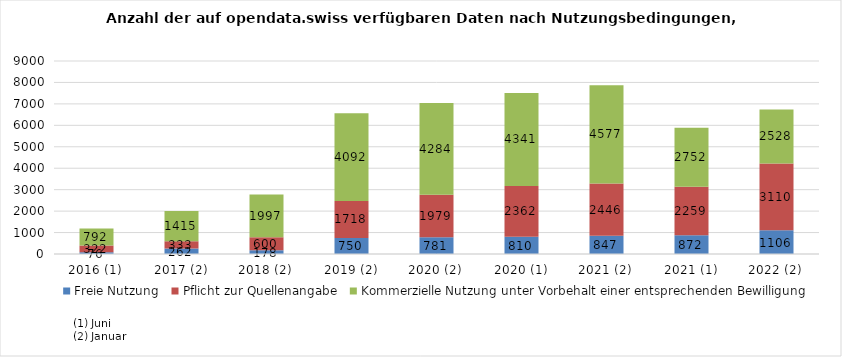
| Category | Freie Nutzung | Pflicht zur Quellenangabe | Kommerzielle Nutzung unter Vorbehalt einer entsprechenden Bewilligung |
|---|---|---|---|
| 2016 (1) | 76 | 322 | 792 |
| 2017 (2) | 262 | 333 | 1415 |
| 2018 (2) | 178 | 600 | 1997 |
| 2019 (2) | 750 | 1718 | 4092 |
| 2020 (2) | 781 | 1979 | 4284 |
| 2020 (1) | 810 | 2362 | 4341 |
| 2021 (2) | 847 | 2446 | 4577 |
| 2021 (1) | 872 | 2259 | 2752 |
| 2022 (2) | 1106 | 3110 | 2528 |